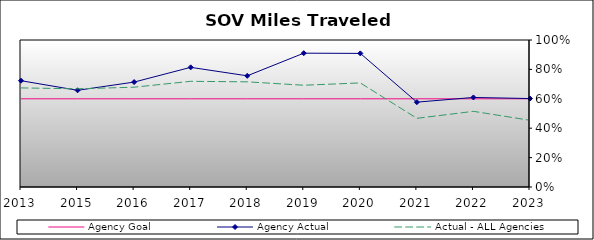
| Category | Agency Goal | Agency Actual | Actual - ALL Agencies |
|---|---|---|---|
| 2013.0 | 0.6 | 0.723 | 0.674 |
| 2015.0 | 0.6 | 0.658 | 0.668 |
| 2016.0 | 0.6 | 0.714 | 0.679 |
| 2017.0 | 0.6 | 0.814 | 0.719 |
| 2018.0 | 0.6 | 0.756 | 0.715 |
| 2019.0 | 0.6 | 0.91 | 0.692 |
| 2020.0 | 0.6 | 0.909 | 0.708 |
| 2021.0 | 0.6 | 0.577 | 0.467 |
| 2022.0 | 0.6 | 0.609 | 0.515 |
| 2023.0 | 0.6 | 0.602 | 0.454 |